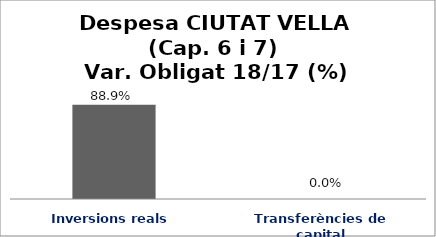
| Category | Series 0 |
|---|---|
| Inversions reals | 0.889 |
| Transferències de capital | 0 |